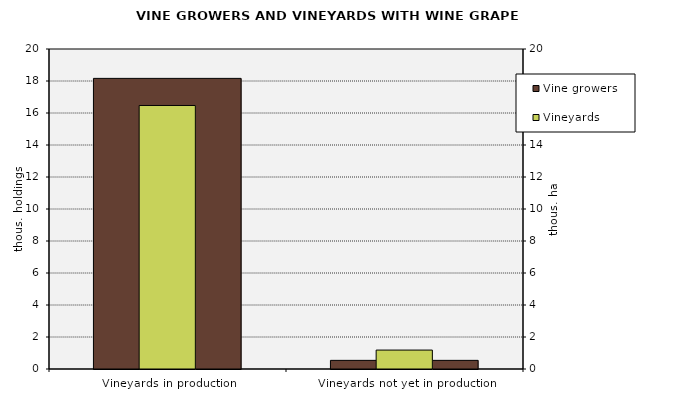
| Category | Vine growers |
|---|---|
| Vineyards in production | 18164 |
| Vineyards not yet in production | 540 |